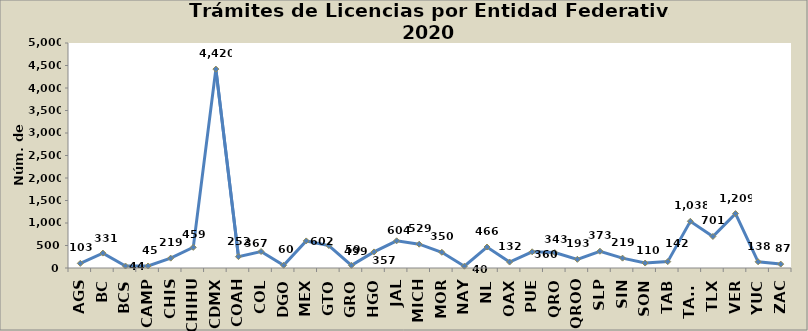
| Category | Series 0 |
|---|---|
| AGS | 103 |
| BC | 331 |
| BCS | 44 |
| CAMP | 45 |
| CHIS | 219 |
| CHIHU | 459 |
| CDMX | 4420 |
| COAH | 252 |
| COL | 367 |
| DGO | 60 |
| MEX | 602 |
| GTO | 499 |
| GRO | 59 |
| HGO | 357 |
| JAL | 604 |
| MICH | 529 |
| MOR | 350 |
| NAY | 40 |
| NL | 466 |
| OAX | 132 |
| PUE | 360 |
| QRO | 343 |
| QROO | 193 |
| SLP | 373 |
| SIN | 219 |
| SON | 110 |
| TAB | 142 |
| TAMS | 1038 |
| TLX | 701 |
| VER | 1209 |
| YUC | 138 |
| ZAC | 87 |